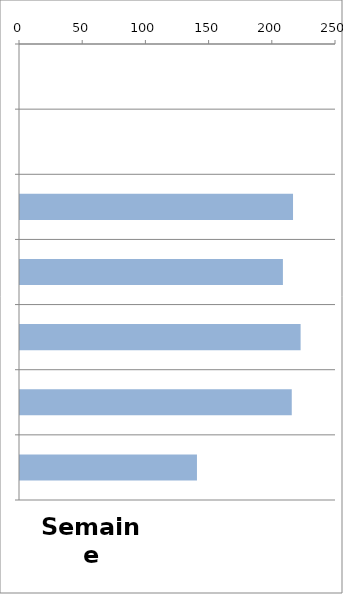
| Category | TV |
|---|---|
| 0 | 0 |
| 1 | 0 |
| 2 | 216 |
| 3 | 208 |
| 4 | 222 |
| 5 | 215 |
| 6 | 140 |